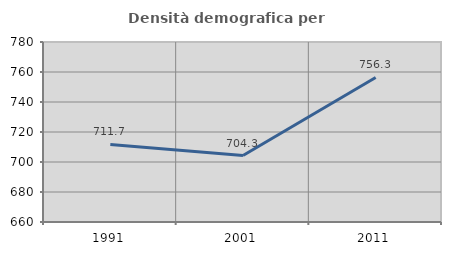
| Category | Densità demografica |
|---|---|
| 1991.0 | 711.689 |
| 2001.0 | 704.305 |
| 2011.0 | 756.345 |